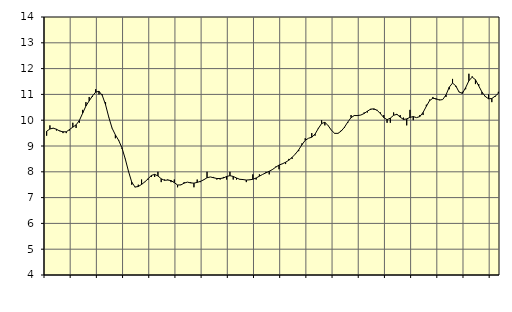
| Category | Piggar | Byggverksamhet, SNI 41-431 |
|---|---|---|
| nan | 9.4 | 9.57 |
| 87.0 | 9.8 | 9.66 |
| 87.0 | 9.7 | 9.69 |
| 87.0 | 9.6 | 9.65 |
| nan | 9.6 | 9.58 |
| 88.0 | 9.5 | 9.55 |
| 88.0 | 9.5 | 9.55 |
| 88.0 | 9.6 | 9.64 |
| nan | 9.9 | 9.73 |
| 89.0 | 9.7 | 9.82 |
| 89.0 | 9.9 | 9.99 |
| 89.0 | 10.4 | 10.27 |
| nan | 10.7 | 10.55 |
| 90.0 | 10.9 | 10.75 |
| 90.0 | 10.9 | 10.94 |
| 90.0 | 11.2 | 11.09 |
| nan | 11 | 11.12 |
| 91.0 | 11 | 10.96 |
| 91.0 | 10.7 | 10.6 |
| 91.0 | 10.1 | 10.11 |
| nan | 9.7 | 9.69 |
| 92.0 | 9.3 | 9.43 |
| 92.0 | 9.2 | 9.22 |
| 92.0 | 8.9 | 8.93 |
| nan | 8.5 | 8.51 |
| 93.0 | 8 | 8.02 |
| 93.0 | 7.5 | 7.6 |
| 93.0 | 7.4 | 7.41 |
| nan | 7.5 | 7.43 |
| 94.0 | 7.7 | 7.51 |
| 94.0 | 7.6 | 7.61 |
| 94.0 | 7.7 | 7.73 |
| nan | 7.8 | 7.86 |
| 95.0 | 7.8 | 7.9 |
| 95.0 | 8 | 7.84 |
| 95.0 | 7.6 | 7.73 |
| nan | 7.7 | 7.67 |
| 96.0 | 7.7 | 7.68 |
| 96.0 | 7.6 | 7.66 |
| 96.0 | 7.7 | 7.58 |
| nan | 7.4 | 7.49 |
| 97.0 | 7.5 | 7.49 |
| 97.0 | 7.6 | 7.56 |
| 97.0 | 7.6 | 7.6 |
| nan | 7.6 | 7.57 |
| 98.0 | 7.4 | 7.56 |
| 98.0 | 7.7 | 7.59 |
| 98.0 | 7.6 | 7.63 |
| nan | 7.7 | 7.69 |
| 99.0 | 8 | 7.77 |
| 99.0 | 7.8 | 7.8 |
| 99.0 | 7.8 | 7.77 |
| nan | 7.7 | 7.74 |
| 0.0 | 7.7 | 7.74 |
| 0.0 | 7.8 | 7.76 |
| 0.0 | 7.7 | 7.82 |
| nan | 8 | 7.85 |
| 1.0 | 7.7 | 7.82 |
| 1.0 | 7.7 | 7.76 |
| 1.0 | 7.7 | 7.71 |
| nan | 7.7 | 7.7 |
| 2.0 | 7.6 | 7.68 |
| 2.0 | 7.7 | 7.69 |
| 2.0 | 7.9 | 7.71 |
| nan | 7.7 | 7.76 |
| 3.0 | 7.9 | 7.83 |
| 3.0 | 7.9 | 7.9 |
| 3.0 | 8 | 7.96 |
| nan | 7.9 | 8.02 |
| 4.0 | 8.1 | 8.09 |
| 4.0 | 8.2 | 8.18 |
| 4.0 | 8.1 | 8.26 |
| nan | 8.3 | 8.31 |
| 5.0 | 8.3 | 8.37 |
| 5.0 | 8.5 | 8.45 |
| 5.0 | 8.5 | 8.56 |
| nan | 8.7 | 8.69 |
| 6.0 | 8.8 | 8.85 |
| 6.0 | 9.1 | 9.05 |
| 6.0 | 9.3 | 9.22 |
| nan | 9.3 | 9.3 |
| 7.0 | 9.5 | 9.34 |
| 7.0 | 9.4 | 9.46 |
| 7.0 | 9.7 | 9.68 |
| nan | 10 | 9.87 |
| 8.0 | 9.8 | 9.92 |
| 8.0 | 9.8 | 9.79 |
| 8.0 | 9.6 | 9.61 |
| nan | 9.5 | 9.49 |
| 9.0 | 9.5 | 9.49 |
| 9.0 | 9.6 | 9.58 |
| 9.0 | 9.7 | 9.73 |
| nan | 9.9 | 9.93 |
| 10.0 | 10.2 | 10.1 |
| 10.0 | 10.2 | 10.18 |
| 10.0 | 10.2 | 10.18 |
| nan | 10.2 | 10.2 |
| 11.0 | 10.3 | 10.26 |
| 11.0 | 10.3 | 10.35 |
| 11.0 | 10.4 | 10.43 |
| nan | 10.4 | 10.44 |
| 12.0 | 10.4 | 10.38 |
| 12.0 | 10.3 | 10.25 |
| 12.0 | 10.2 | 10.1 |
| nan | 9.9 | 10.02 |
| 13.0 | 9.9 | 10.08 |
| 13.0 | 10.3 | 10.19 |
| 13.0 | 10.2 | 10.23 |
| nan | 10.2 | 10.12 |
| 14.0 | 10.1 | 10.03 |
| 14.0 | 9.8 | 10.05 |
| 14.0 | 10.4 | 10.11 |
| nan | 10 | 10.14 |
| 15.0 | 10.1 | 10.1 |
| 15.0 | 10.2 | 10.14 |
| 15.0 | 10.2 | 10.3 |
| nan | 10.6 | 10.54 |
| 16.0 | 10.8 | 10.76 |
| 16.0 | 10.9 | 10.85 |
| 16.0 | 10.8 | 10.83 |
| nan | 10.8 | 10.78 |
| 17.0 | 10.8 | 10.8 |
| 17.0 | 10.9 | 10.98 |
| 17.0 | 11.2 | 11.28 |
| nan | 11.6 | 11.44 |
| 18.0 | 11.3 | 11.33 |
| 18.0 | 11.1 | 11.09 |
| 18.0 | 11.1 | 11.04 |
| nan | 11.2 | 11.26 |
| 19.0 | 11.8 | 11.53 |
| 19.0 | 11.7 | 11.67 |
| 19.0 | 11.4 | 11.57 |
| nan | 11.4 | 11.33 |
| 20.0 | 11 | 11.09 |
| 20.0 | 10.9 | 10.92 |
| 20.0 | 11 | 10.83 |
| nan | 10.7 | 10.84 |
| 21.0 | 10.9 | 10.93 |
| 21.0 | 11.1 | 11.04 |